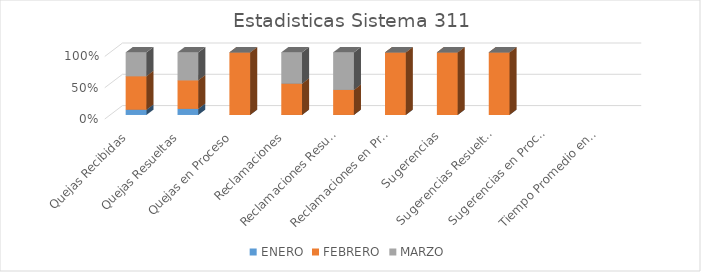
| Category | ENERO | FEBRERO | MARZO |
|---|---|---|---|
| Quejas Recibidas | 16 | 103 | 73 |
| Quejas Resueltas | 16 | 75 | 73 |
| Quejas en Proceso | 0 | 28 | 0 |
| Reclamaciones | 0 | 3 | 3 |
| Reclamaciones Resueltas | 0 | 2 | 3 |
| Reclamaciones en Proceso | 0 | 1 | 0 |
| Sugerencias | 0 | 2 | 0 |
| Sugerencias Resueltas | 0 | 2 | 0 |
| Sugerencias en Proceso | 0 | 0 | 0 |
| Tiempo Promedio en que fueron Respondidas | 0 | 0 | 0 |